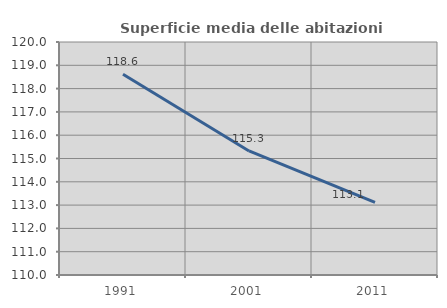
| Category | Superficie media delle abitazioni occupate |
|---|---|
| 1991.0 | 118.614 |
| 2001.0 | 115.323 |
| 2011.0 | 113.113 |